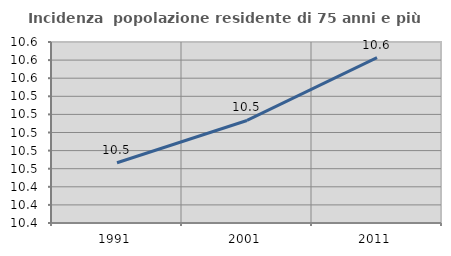
| Category | Incidenza  popolazione residente di 75 anni e più |
|---|---|
| 1991.0 | 10.467 |
| 2001.0 | 10.513 |
| 2011.0 | 10.583 |